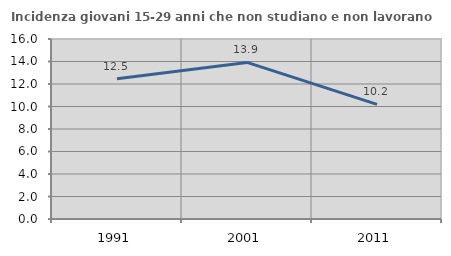
| Category | Incidenza giovani 15-29 anni che non studiano e non lavorano  |
|---|---|
| 1991.0 | 12.46 |
| 2001.0 | 13.918 |
| 2011.0 | 10.191 |